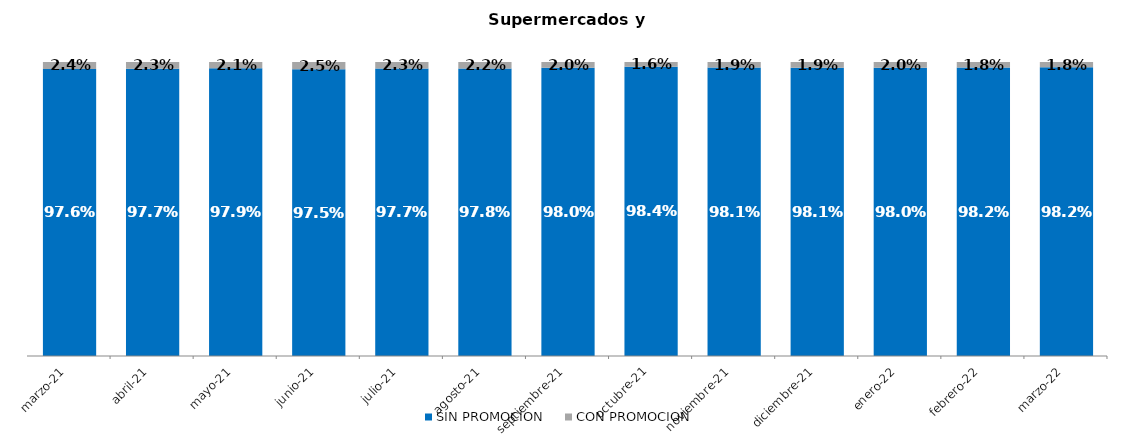
| Category | SIN PROMOCION   | CON PROMOCION   |
|---|---|---|
| 2021-03-01 | 0.976 | 0.024 |
| 2021-04-01 | 0.977 | 0.023 |
| 2021-05-01 | 0.979 | 0.021 |
| 2021-06-01 | 0.975 | 0.025 |
| 2021-07-01 | 0.977 | 0.023 |
| 2021-08-01 | 0.978 | 0.022 |
| 2021-09-01 | 0.98 | 0.02 |
| 2021-10-01 | 0.984 | 0.016 |
| 2021-11-01 | 0.981 | 0.019 |
| 2021-12-01 | 0.981 | 0.019 |
| 2022-01-01 | 0.98 | 0.02 |
| 2022-02-01 | 0.982 | 0.018 |
| 2022-03-01 | 0.982 | 0.018 |